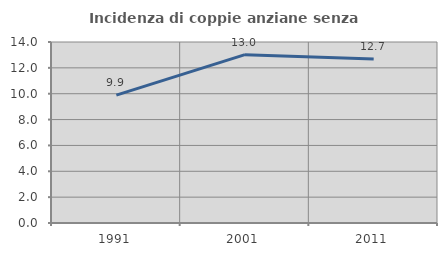
| Category | Incidenza di coppie anziane senza figli  |
|---|---|
| 1991.0 | 9.89 |
| 2001.0 | 13.021 |
| 2011.0 | 12.683 |